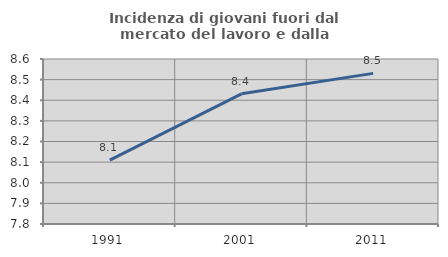
| Category | Incidenza di giovani fuori dal mercato del lavoro e dalla formazione  |
|---|---|
| 1991.0 | 8.109 |
| 2001.0 | 8.431 |
| 2011.0 | 8.53 |